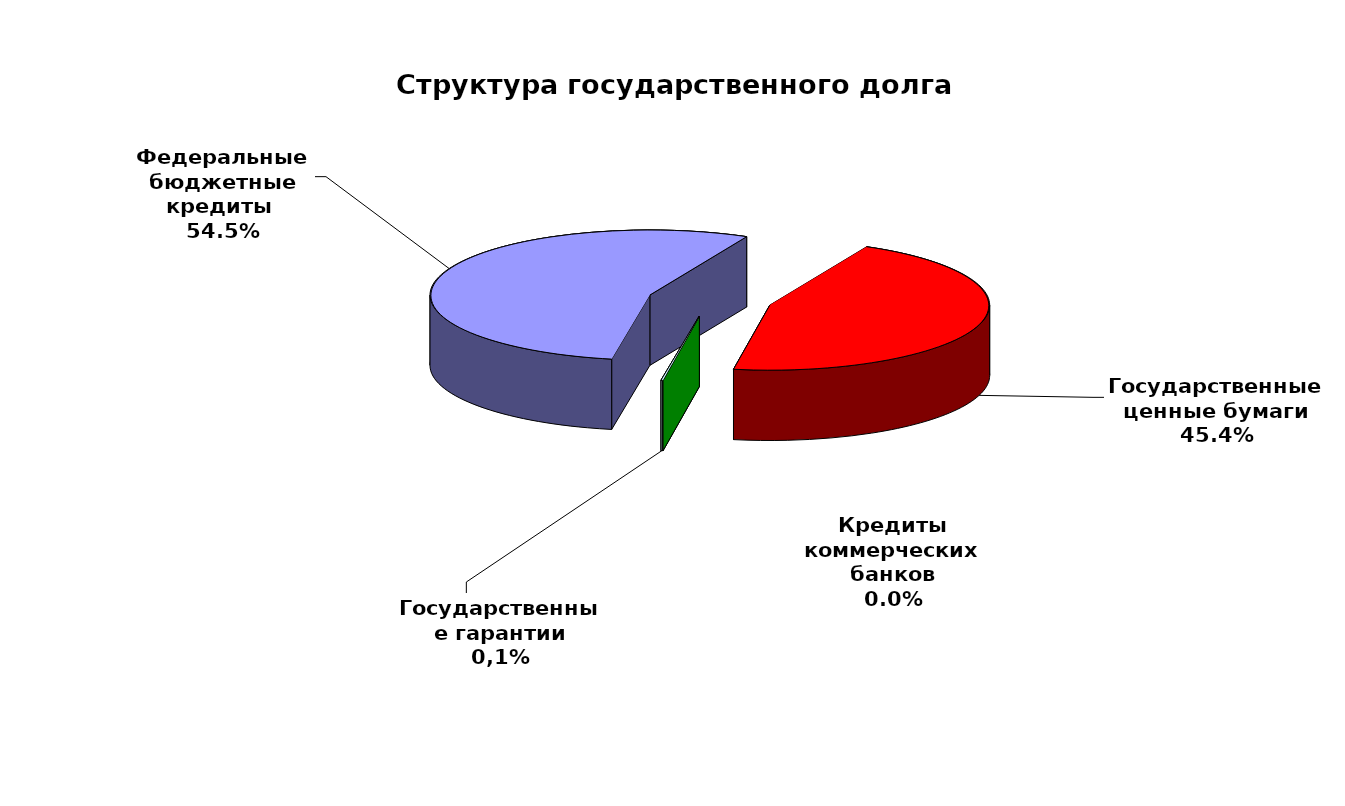
| Category | Series 0 |
|---|---|
| Федеральные бюджетные кредиты  | 55705077.413 |
| Государственные ценные бумаги | 46400000 |
| Кредиты коммерческих банков | 0 |
| Государственные гарантии | 138270.964 |